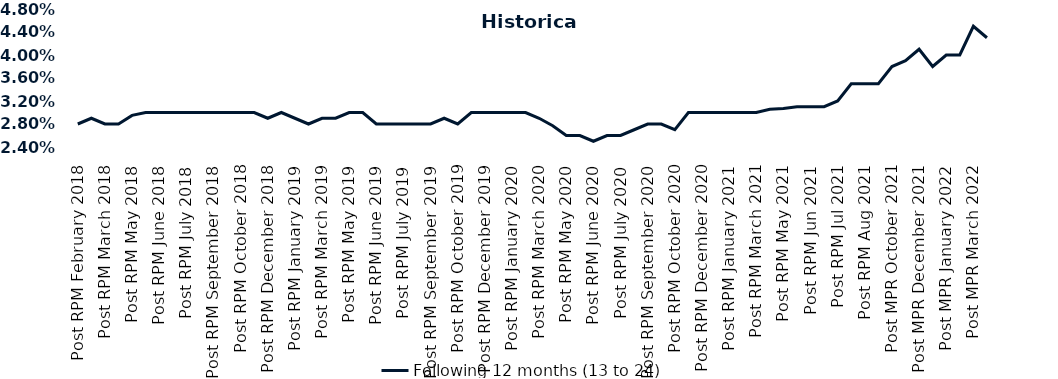
| Category | Following 12 months (13 to 24)  |
|---|---|
| Post RPM February 2018 | 0.028 |
| Pre RPM March 2018 | 0.029 |
| Post RPM March 2018 | 0.028 |
| Pre RPM May 2018 | 0.028 |
| Post RPM May 2018 | 0.03 |
| Pre RPM June 2018 | 0.03 |
| Post RPM June 2018 | 0.03 |
| Pre RPM July 2018 | 0.03 |
| Post RPM July 2018 | 0.03 |
| Pre RPM September 2018 | 0.03 |
| Post RPM September 2018 | 0.03 |
| Pre RPM October 2018 | 0.03 |
| Post RPM October 2018 | 0.03 |
| Pre RPM December 2018 | 0.03 |
| Post RPM December 2018 | 0.029 |
| Pre RPM January 2019 | 0.03 |
| Post RPM January 2019 | 0.029 |
| Pre RPM March 2019 | 0.028 |
| Post RPM March 2019 | 0.029 |
| Pre RPM May 2019 | 0.029 |
| Post RPM May 2019 | 0.03 |
| Pre RPM June 2019 | 0.03 |
| Post RPM June 2019 | 0.028 |
| Pre RPM July 2019 | 0.028 |
| Post RPM July 2019 | 0.028 |
| Pre RPM September 2019 | 0.028 |
| Post RPM September 2019 | 0.028 |
| Pre RPM October 2019 | 0.029 |
| Post RPM October 2019 | 0.028 |
| Pre RPM December 2019 | 0.03 |
| Post RPM December 2019 | 0.03 |
| Pre RPM January 2020 | 0.03 |
| Post RPM January 2020 | 0.03 |
| Pre RPM March 2020 | 0.03 |
| Post RPM March 2020 | 0.029 |
| Pre RPM May 2020 | 0.028 |
| Post RPM May 2020 | 0.026 |
| Pre RPM June 2020 | 0.026 |
| Post RPM June 2020 | 0.025 |
| Pre RPM July 2020 | 0.026 |
| Post RPM July 2020 | 0.026 |
| Pre RPM September 2020 | 0.027 |
| Post RPM September 2020 | 0.028 |
| Pre RPM October 2020 | 0.028 |
| Post RPM October 2020 | 0.027 |
| Pre RPM December 2020 | 0.03 |
|  Post RPM December 2020 | 0.03 |
| Pre RPM January 2021 | 0.03 |
| Post RPM January 2021 | 0.03 |
|  Pre RPM March 2021 | 0.03 |
|  Post RPM March 2021 | 0.03 |
|  Pre RPM May 2021 | 0.031 |
|  Post RPM May 2021 | 0.031 |
|  Pre RPM Jun 2021 | 0.031 |
|   Post RPM Jun 2021 | 0.031 |
| Pre RPM Jul 2021 | 0.031 |
|  Post RPM Jul 2021 | 0.032 |
| Pre RPM Aug 2021 | 0.035 |
|  Post RPM Aug 2021 | 0.035 |
| Pre MPR October 2021 | 0.035 |
| Post MPR October 2021 | 0.038 |
| Pre MPR December 2021 | 0.039 |
| Post MPR December 2021 | 0.041 |
| Pre MPR January 2022 | 0.038 |
| Post MPR January 2022 | 0.04 |
| Pre MPR March 2022 | 0.04 |
| Post MPR March 2022 | 0.045 |
| Pre MPR May 2022 | 0.043 |